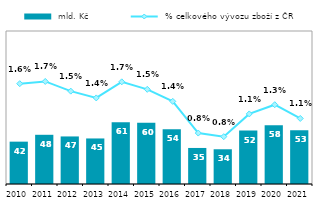
| Category |  mld. Kč |
|---|---|
| 2010.0 | 41.516 |
| 2011.0 | 48.242 |
| 2012.0 | 46.622 |
| 2013.0 | 44.651 |
| 2014.0 | 60.574 |
| 2015.0 | 60.08 |
| 2016.0 | 53.661 |
| 2017.0 | 35.335 |
| 2018.0 | 34.049 |
| 2019.0 | 52.438 |
| 2020.0 | 57.544 |
| 2021.0 | 52.806 |